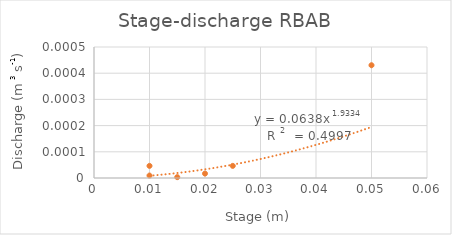
| Category | QA (m3/s) |
|---|---|
| 0.02 | 0 |
| 0.01 | 0 |
| 0.015 | 0 |
| 0.05 | 0 |
| 0.025 | 0 |
| 0.01 | 0 |